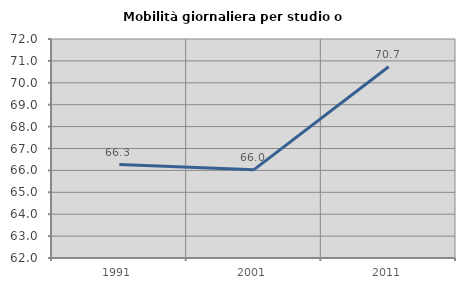
| Category | Mobilità giornaliera per studio o lavoro |
|---|---|
| 1991.0 | 66.268 |
| 2001.0 | 66.035 |
| 2011.0 | 70.732 |